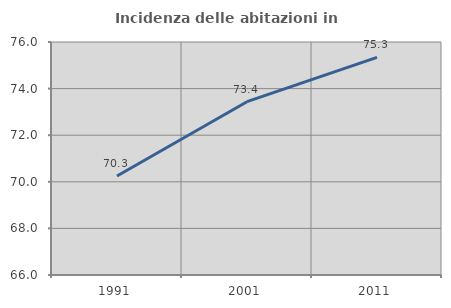
| Category | Incidenza delle abitazioni in proprietà  |
|---|---|
| 1991.0 | 70.251 |
| 2001.0 | 73.438 |
| 2011.0 | 75.338 |